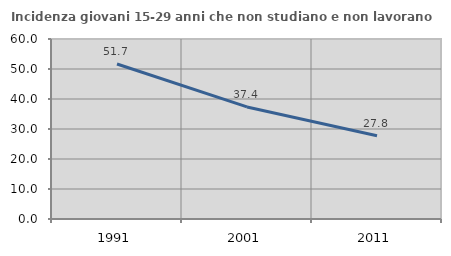
| Category | Incidenza giovani 15-29 anni che non studiano e non lavorano  |
|---|---|
| 1991.0 | 51.659 |
| 2001.0 | 37.354 |
| 2011.0 | 27.767 |